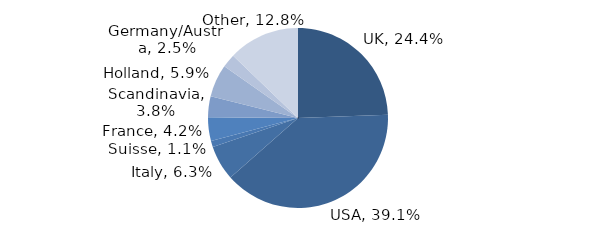
| Category | Investment Style |
|---|---|
| UK | 0.244 |
| USA | 0.391 |
| Italy | 0.063 |
| Suisse | 0.011 |
| France | 0.042 |
| Scandinavia | 0.038 |
| Holland | 0.059 |
| Germany/Austria | 0.025 |
| Other | 0.128 |